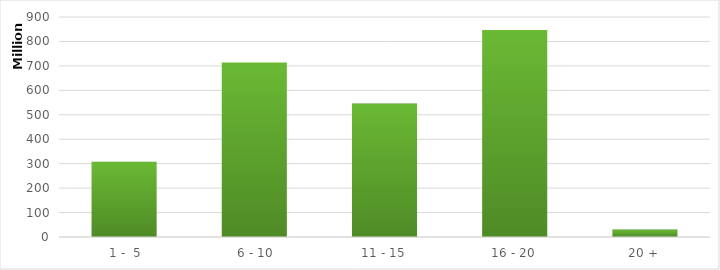
| Category | Series 0 |
|---|---|
|  1 -  5 | 307647885.25 |
|  6 - 10 | 713874241.84 |
| 11 - 15 | 545715109.19 |
| 16 - 20 | 847198864.61 |
| 20 + | 30296969.71 |